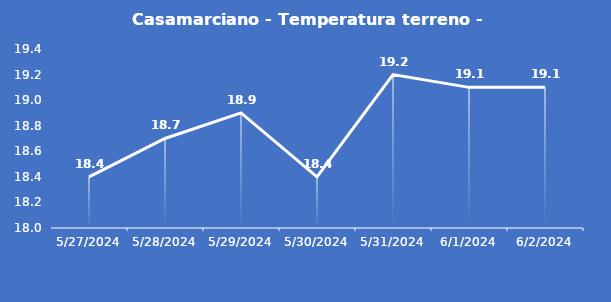
| Category | Casamarciano - Temperatura terreno - Grezzo (°C) |
|---|---|
| 5/27/24 | 18.4 |
| 5/28/24 | 18.7 |
| 5/29/24 | 18.9 |
| 5/30/24 | 18.4 |
| 5/31/24 | 19.2 |
| 6/1/24 | 19.1 |
| 6/2/24 | 19.1 |